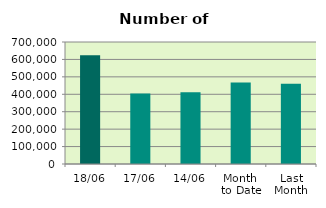
| Category | Series 0 |
|---|---|
| 18/06 | 624524 |
| 17/06 | 404624 |
| 14/06 | 412094 |
| Month 
to Date | 468214 |
| Last
Month | 461152.818 |